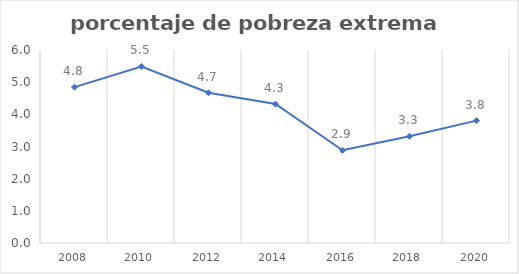
| Category | Series 0 |
|---|---|
| 2008.0 | 4.845 |
| 2010.0 | 5.487 |
| 2012.0 | 4.67 |
| 2014.0 | 4.321 |
| 2016.0 | 2.882 |
| 2018.0 | 3.317 |
| 2020.0 | 3.805 |